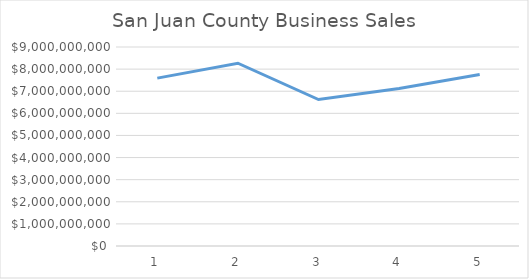
| Category | Series 0 |
|---|---|
| 0 | 7592616633.98 |
| 1 | 8266462356.205 |
| 2 | 6625950338.608 |
| 3 | 7118572000.433 |
| 4 | 7759302949.665 |